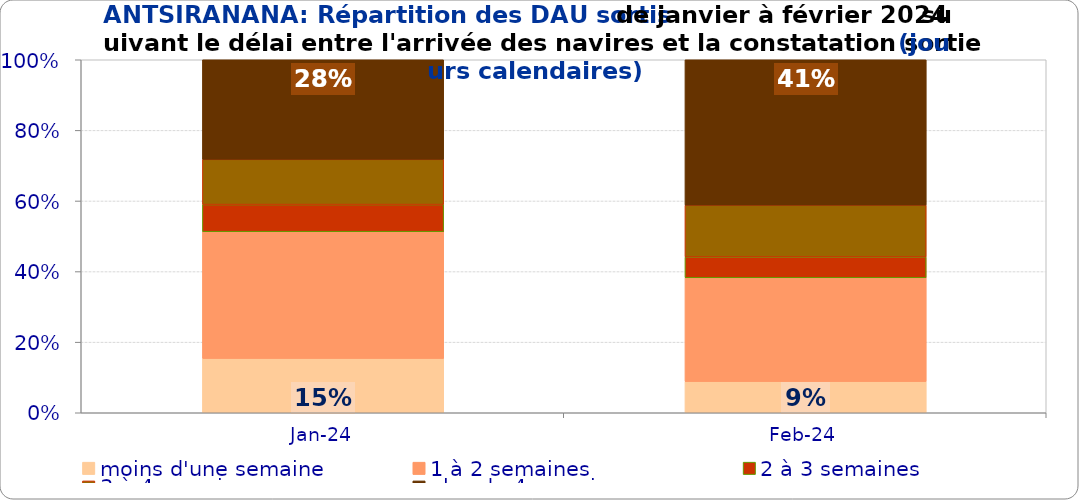
| Category | moins d'une semaine | 1 à 2 semaines | 2 à 3 semaines | 3 à 4 semaines | plus de 4 semaines |
|---|---|---|---|---|---|
| 2024-01-01 | 0.154 | 0.359 | 0.077 | 0.128 | 0.282 |
| 2024-02-01 | 0.088 | 0.294 | 0.059 | 0.147 | 0.412 |